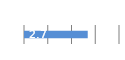
| Category | Series 0 |
|---|---|
| 0 | 2.684 |